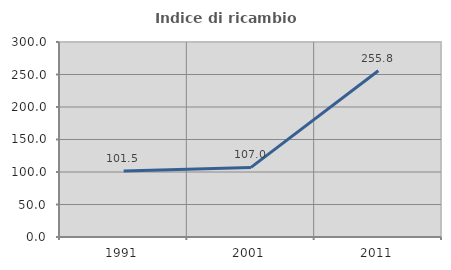
| Category | Indice di ricambio occupazionale  |
|---|---|
| 1991.0 | 101.493 |
| 2001.0 | 107.042 |
| 2011.0 | 255.814 |